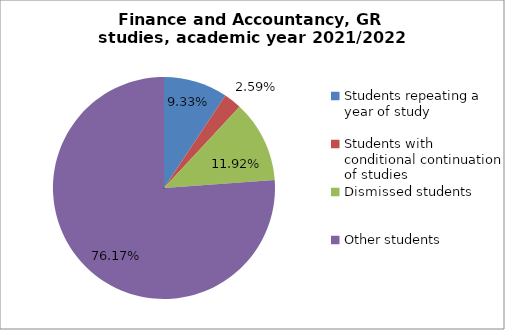
| Category | Series 0 |
|---|---|
| Students repeating a year of study | 18 |
| Students with conditional continuation of studies | 5 |
| Dismissed students | 23 |
| Other students | 147 |